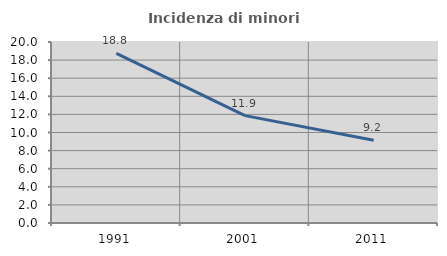
| Category | Incidenza di minori stranieri |
|---|---|
| 1991.0 | 18.75 |
| 2001.0 | 11.864 |
| 2011.0 | 9.15 |